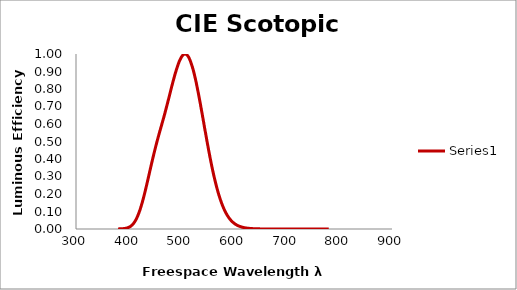
| Category | Series 0 |
|---|---|
| 380.0 | 0.001 |
| 381.0 | 0.001 |
| 382.0 | 0.001 |
| 383.0 | 0.001 |
| 384.0 | 0.001 |
| 385.0 | 0.001 |
| 386.0 | 0.001 |
| 387.0 | 0.001 |
| 388.0 | 0.002 |
| 389.0 | 0.002 |
| 390.0 | 0.002 |
| 391.0 | 0.003 |
| 392.0 | 0.003 |
| 393.0 | 0.003 |
| 394.0 | 0.004 |
| 395.0 | 0.005 |
| 396.0 | 0.005 |
| 397.0 | 0.006 |
| 398.0 | 0.007 |
| 399.0 | 0.008 |
| 400.0 | 0.009 |
| 401.0 | 0.011 |
| 402.0 | 0.012 |
| 403.0 | 0.014 |
| 404.0 | 0.016 |
| 405.0 | 0.019 |
| 406.0 | 0.021 |
| 407.0 | 0.024 |
| 408.0 | 0.027 |
| 409.0 | 0.031 |
| 410.0 | 0.035 |
| 411.0 | 0.039 |
| 412.0 | 0.044 |
| 413.0 | 0.049 |
| 414.0 | 0.054 |
| 415.0 | 0.06 |
| 416.0 | 0.067 |
| 417.0 | 0.074 |
| 418.0 | 0.081 |
| 419.0 | 0.088 |
| 420.0 | 0.097 |
| 421.0 | 0.105 |
| 422.0 | 0.114 |
| 423.0 | 0.124 |
| 424.0 | 0.133 |
| 425.0 | 0.144 |
| 426.0 | 0.154 |
| 427.0 | 0.165 |
| 428.0 | 0.176 |
| 429.0 | 0.188 |
| 430.0 | 0.2 |
| 431.0 | 0.212 |
| 432.0 | 0.224 |
| 433.0 | 0.237 |
| 434.0 | 0.25 |
| 435.0 | 0.262 |
| 436.0 | 0.276 |
| 437.0 | 0.289 |
| 438.0 | 0.302 |
| 439.0 | 0.315 |
| 440.0 | 0.328 |
| 441.0 | 0.341 |
| 442.0 | 0.354 |
| 443.0 | 0.367 |
| 444.0 | 0.38 |
| 445.0 | 0.393 |
| 446.0 | 0.406 |
| 447.0 | 0.418 |
| 448.0 | 0.431 |
| 449.0 | 0.443 |
| 450.0 | 0.455 |
| 451.0 | 0.467 |
| 452.0 | 0.479 |
| 453.0 | 0.49 |
| 454.0 | 0.502 |
| 455.0 | 0.513 |
| 456.0 | 0.524 |
| 457.0 | 0.535 |
| 458.0 | 0.546 |
| 459.0 | 0.557 |
| 460.0 | 0.567 |
| 461.0 | 0.578 |
| 462.0 | 0.588 |
| 463.0 | 0.599 |
| 464.0 | 0.61 |
| 465.0 | 0.62 |
| 466.0 | 0.631 |
| 467.0 | 0.642 |
| 468.0 | 0.653 |
| 469.0 | 0.664 |
| 470.0 | 0.676 |
| 471.0 | 0.687 |
| 472.0 | 0.699 |
| 473.0 | 0.71 |
| 474.0 | 0.722 |
| 475.0 | 0.734 |
| 476.0 | 0.745 |
| 477.0 | 0.757 |
| 478.0 | 0.769 |
| 479.0 | 0.781 |
| 480.0 | 0.793 |
| 481.0 | 0.805 |
| 482.0 | 0.817 |
| 483.0 | 0.828 |
| 484.0 | 0.84 |
| 485.0 | 0.851 |
| 486.0 | 0.862 |
| 487.0 | 0.873 |
| 488.0 | 0.884 |
| 489.0 | 0.894 |
| 490.0 | 0.904 |
| 491.0 | 0.914 |
| 492.0 | 0.923 |
| 493.0 | 0.932 |
| 494.0 | 0.941 |
| 495.0 | 0.949 |
| 496.0 | 0.957 |
| 497.0 | 0.964 |
| 498.0 | 0.97 |
| 499.0 | 0.976 |
| 500.0 | 0.982 |
| 501.0 | 0.986 |
| 502.0 | 0.99 |
| 503.0 | 0.994 |
| 504.0 | 0.997 |
| 505.0 | 0.998 |
| 506.0 | 1 |
| 507.0 | 1 |
| 508.0 | 1 |
| 509.0 | 0.998 |
| 510.0 | 0.997 |
| 511.0 | 0.994 |
| 512.0 | 0.99 |
| 513.0 | 0.986 |
| 514.0 | 0.981 |
| 515.0 | 0.975 |
| 516.0 | 0.968 |
| 517.0 | 0.961 |
| 518.0 | 0.953 |
| 519.0 | 0.944 |
| 520.0 | 0.935 |
| 521.0 | 0.925 |
| 522.0 | 0.915 |
| 523.0 | 0.904 |
| 524.0 | 0.892 |
| 525.0 | 0.88 |
| 526.0 | 0.867 |
| 527.0 | 0.854 |
| 528.0 | 0.84 |
| 529.0 | 0.826 |
| 530.0 | 0.811 |
| 531.0 | 0.796 |
| 532.0 | 0.781 |
| 533.0 | 0.765 |
| 534.0 | 0.749 |
| 535.0 | 0.733 |
| 536.0 | 0.717 |
| 537.0 | 0.7 |
| 538.0 | 0.683 |
| 539.0 | 0.667 |
| 540.0 | 0.65 |
| 541.0 | 0.633 |
| 542.0 | 0.616 |
| 543.0 | 0.599 |
| 544.0 | 0.581 |
| 545.0 | 0.564 |
| 546.0 | 0.548 |
| 547.0 | 0.531 |
| 548.0 | 0.514 |
| 549.0 | 0.497 |
| 550.0 | 0.481 |
| 551.0 | 0.465 |
| 552.0 | 0.448 |
| 553.0 | 0.433 |
| 554.0 | 0.417 |
| 555.0 | 0.402 |
| 556.0 | 0.386 |
| 557.0 | 0.372 |
| 558.0 | 0.357 |
| 559.0 | 0.343 |
| 560.0 | 0.329 |
| 561.0 | 0.315 |
| 562.0 | 0.302 |
| 563.0 | 0.289 |
| 564.0 | 0.276 |
| 565.0 | 0.264 |
| 566.0 | 0.252 |
| 567.0 | 0.24 |
| 568.0 | 0.229 |
| 569.0 | 0.218 |
| 570.0 | 0.208 |
| 571.0 | 0.197 |
| 572.0 | 0.188 |
| 573.0 | 0.178 |
| 574.0 | 0.169 |
| 575.0 | 0.16 |
| 576.0 | 0.152 |
| 577.0 | 0.144 |
| 578.0 | 0.136 |
| 579.0 | 0.128 |
| 580.0 | 0.121 |
| 581.0 | 0.114 |
| 582.0 | 0.108 |
| 583.0 | 0.102 |
| 584.0 | 0.096 |
| 585.0 | 0.09 |
| 586.0 | 0.084 |
| 587.0 | 0.079 |
| 588.0 | 0.074 |
| 589.0 | 0.07 |
| 590.0 | 0.066 |
| 591.0 | 0.061 |
| 592.0 | 0.057 |
| 593.0 | 0.054 |
| 594.0 | 0.05 |
| 595.0 | 0.047 |
| 596.0 | 0.044 |
| 597.0 | 0.041 |
| 598.0 | 0.038 |
| 599.0 | 0.036 |
| 600.0 | 0.033 |
| 601.0 | 0.031 |
| 602.0 | 0.029 |
| 603.0 | 0.027 |
| 604.0 | 0.025 |
| 605.0 | 0.023 |
| 606.0 | 0.021 |
| 607.0 | 0.02 |
| 608.0 | 0.019 |
| 609.0 | 0.017 |
| 610.0 | 0.016 |
| 611.0 | 0.015 |
| 612.0 | 0.014 |
| 613.0 | 0.013 |
| 614.0 | 0.012 |
| 615.0 | 0.011 |
| 616.0 | 0.01 |
| 617.0 | 0.009 |
| 618.0 | 0.009 |
| 619.0 | 0.008 |
| 620.0 | 0.007 |
| 621.0 | 0.007 |
| 622.0 | 0.006 |
| 623.0 | 0.006 |
| 624.0 | 0.005 |
| 625.0 | 0.005 |
| 626.0 | 0.005 |
| 627.0 | 0.004 |
| 628.0 | 0.004 |
| 629.0 | 0.004 |
| 630.0 | 0.003 |
| 631.0 | 0.003 |
| 632.0 | 0.003 |
| 633.0 | 0.003 |
| 634.0 | 0.002 |
| 635.0 | 0.002 |
| 636.0 | 0.002 |
| 637.0 | 0.002 |
| 638.0 | 0.002 |
| 639.0 | 0.002 |
| 640.0 | 0.001 |
| 641.0 | 0.001 |
| 642.0 | 0.001 |
| 643.0 | 0.001 |
| 644.0 | 0.001 |
| 645.0 | 0.001 |
| 646.0 | 0.001 |
| 647.0 | 0.001 |
| 648.0 | 0.001 |
| 649.0 | 0.001 |
| 650.0 | 0.001 |
| 651.0 | 0.001 |
| 652.0 | 0.001 |
| 653.0 | 0.001 |
| 654.0 | 0 |
| 655.0 | 0 |
| 656.0 | 0 |
| 657.0 | 0 |
| 658.0 | 0 |
| 659.0 | 0 |
| 660.0 | 0 |
| 661.0 | 0 |
| 662.0 | 0 |
| 663.0 | 0 |
| 664.0 | 0 |
| 665.0 | 0 |
| 666.0 | 0 |
| 667.0 | 0 |
| 668.0 | 0 |
| 669.0 | 0 |
| 670.0 | 0 |
| 671.0 | 0 |
| 672.0 | 0 |
| 673.0 | 0 |
| 674.0 | 0 |
| 675.0 | 0 |
| 676.0 | 0 |
| 677.0 | 0 |
| 678.0 | 0 |
| 679.0 | 0 |
| 680.0 | 0 |
| 681.0 | 0 |
| 682.0 | 0 |
| 683.0 | 0 |
| 684.0 | 0 |
| 685.0 | 0 |
| 686.0 | 0 |
| 687.0 | 0 |
| 688.0 | 0 |
| 689.0 | 0 |
| 690.0 | 0 |
| 691.0 | 0 |
| 692.0 | 0 |
| 693.0 | 0 |
| 694.0 | 0 |
| 695.0 | 0 |
| 696.0 | 0 |
| 697.0 | 0 |
| 698.0 | 0 |
| 699.0 | 0 |
| 700.0 | 0 |
| 701.0 | 0 |
| 702.0 | 0 |
| 703.0 | 0 |
| 704.0 | 0 |
| 705.0 | 0 |
| 706.0 | 0 |
| 707.0 | 0 |
| 708.0 | 0 |
| 709.0 | 0 |
| 710.0 | 0 |
| 711.0 | 0 |
| 712.0 | 0 |
| 713.0 | 0 |
| 714.0 | 0 |
| 715.0 | 0 |
| 716.0 | 0 |
| 717.0 | 0 |
| 718.0 | 0 |
| 719.0 | 0 |
| 720.0 | 0 |
| 721.0 | 0 |
| 722.0 | 0 |
| 723.0 | 0 |
| 724.0 | 0 |
| 725.0 | 0 |
| 726.0 | 0 |
| 727.0 | 0 |
| 728.0 | 0 |
| 729.0 | 0 |
| 730.0 | 0 |
| 731.0 | 0 |
| 732.0 | 0 |
| 733.0 | 0 |
| 734.0 | 0 |
| 735.0 | 0 |
| 736.0 | 0 |
| 737.0 | 0 |
| 738.0 | 0 |
| 739.0 | 0 |
| 740.0 | 0 |
| 741.0 | 0 |
| 742.0 | 0 |
| 743.0 | 0 |
| 744.0 | 0 |
| 745.0 | 0 |
| 746.0 | 0 |
| 747.0 | 0 |
| 748.0 | 0 |
| 749.0 | 0 |
| 750.0 | 0 |
| 751.0 | 0 |
| 752.0 | 0 |
| 753.0 | 0 |
| 754.0 | 0 |
| 755.0 | 0 |
| 756.0 | 0 |
| 757.0 | 0 |
| 758.0 | 0 |
| 759.0 | 0 |
| 760.0 | 0 |
| 761.0 | 0 |
| 762.0 | 0 |
| 763.0 | 0 |
| 764.0 | 0 |
| 765.0 | 0 |
| 766.0 | 0 |
| 767.0 | 0 |
| 768.0 | 0 |
| 769.0 | 0 |
| 770.0 | 0 |
| 771.0 | 0 |
| 772.0 | 0 |
| 773.0 | 0 |
| 774.0 | 0 |
| 775.0 | 0 |
| 776.0 | 0 |
| 777.0 | 0 |
| 778.0 | 0 |
| 779.0 | 0 |
| 780.0 | 0 |